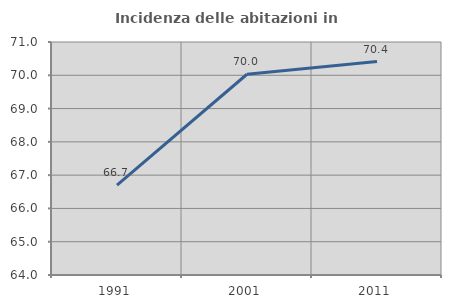
| Category | Incidenza delle abitazioni in proprietà  |
|---|---|
| 1991.0 | 66.702 |
| 2001.0 | 70.031 |
| 2011.0 | 70.413 |